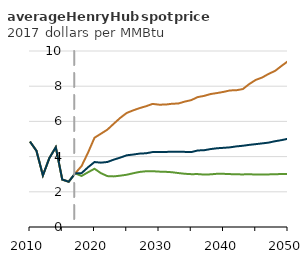
| Category | High oil and gas resource and technology | Low oil and gas resource and technology | Reference |
|---|---|---|---|
| 2010.0 | 4.852 | 4.852 | 4.852 |
| 2011.0 | 4.331 | 4.331 | 4.331 |
| 2012.0 | 2.93 | 2.93 | 2.93 |
| 2013.0 | 3.915 | 3.915 | 3.915 |
| 2014.0 | 4.533 | 4.533 | 4.533 |
| 2015.0 | 2.697 | 2.697 | 2.697 |
| 2016.0 | 2.573 | 2.573 | 2.573 |
| 2017.0 | 3.045 | 3.045 | 3.045 |
| 2018.0 | 2.901 | 3.464 | 3.062 |
| 2019.0 | 3.11 | 4.227 | 3.395 |
| 2020.0 | 3.309 | 5.071 | 3.691 |
| 2021.0 | 3.057 | 5.301 | 3.656 |
| 2022.0 | 2.892 | 5.532 | 3.694 |
| 2023.0 | 2.875 | 5.873 | 3.829 |
| 2024.0 | 2.917 | 6.203 | 3.943 |
| 2025.0 | 2.97 | 6.48 | 4.074 |
| 2026.0 | 3.055 | 6.628 | 4.117 |
| 2027.0 | 3.129 | 6.756 | 4.17 |
| 2028.0 | 3.168 | 6.863 | 4.189 |
| 2029.0 | 3.171 | 6.995 | 4.257 |
| 2030.0 | 3.147 | 6.952 | 4.262 |
| 2031.0 | 3.136 | 6.955 | 4.265 |
| 2032.0 | 3.113 | 7.002 | 4.275 |
| 2033.0 | 3.065 | 7.017 | 4.269 |
| 2034.0 | 3.024 | 7.126 | 4.268 |
| 2035.0 | 3.002 | 7.209 | 4.256 |
| 2036.0 | 3.006 | 7.381 | 4.349 |
| 2037.0 | 2.979 | 7.45 | 4.362 |
| 2038.0 | 2.992 | 7.555 | 4.428 |
| 2039.0 | 3.024 | 7.611 | 4.474 |
| 2040.0 | 3.022 | 7.676 | 4.498 |
| 2041.0 | 3.006 | 7.76 | 4.526 |
| 2042.0 | 2.992 | 7.771 | 4.58 |
| 2043.0 | 2.988 | 7.837 | 4.616 |
| 2044.0 | 2.998 | 8.124 | 4.667 |
| 2045.0 | 2.981 | 8.358 | 4.708 |
| 2046.0 | 2.979 | 8.495 | 4.751 |
| 2047.0 | 2.989 | 8.7 | 4.795 |
| 2048.0 | 2.998 | 8.87 | 4.875 |
| 2049.0 | 3.01 | 9.153 | 4.936 |
| 2050.0 | 3.015 | 9.422 | 5.015 |